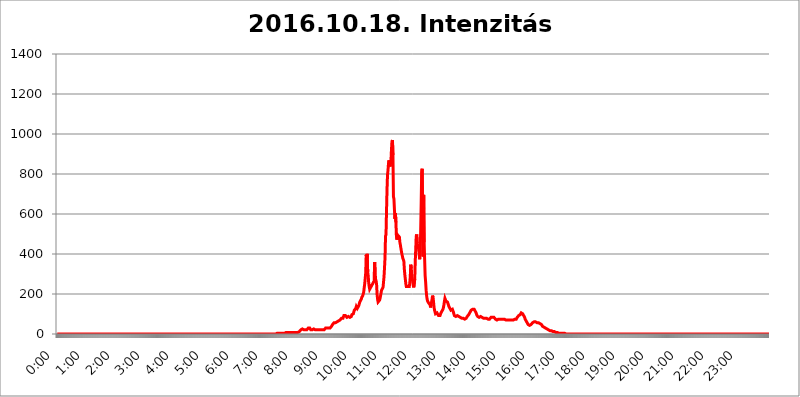
| Category | 2016.10.18. Intenzitás [W/m^2] |
|---|---|
| 0.0 | 0 |
| 0.0006944444444444445 | 0 |
| 0.001388888888888889 | 0 |
| 0.0020833333333333333 | 0 |
| 0.002777777777777778 | 0 |
| 0.003472222222222222 | 0 |
| 0.004166666666666667 | 0 |
| 0.004861111111111111 | 0 |
| 0.005555555555555556 | 0 |
| 0.0062499999999999995 | 0 |
| 0.006944444444444444 | 0 |
| 0.007638888888888889 | 0 |
| 0.008333333333333333 | 0 |
| 0.009027777777777779 | 0 |
| 0.009722222222222222 | 0 |
| 0.010416666666666666 | 0 |
| 0.011111111111111112 | 0 |
| 0.011805555555555555 | 0 |
| 0.012499999999999999 | 0 |
| 0.013194444444444444 | 0 |
| 0.013888888888888888 | 0 |
| 0.014583333333333332 | 0 |
| 0.015277777777777777 | 0 |
| 0.015972222222222224 | 0 |
| 0.016666666666666666 | 0 |
| 0.017361111111111112 | 0 |
| 0.018055555555555557 | 0 |
| 0.01875 | 0 |
| 0.019444444444444445 | 0 |
| 0.02013888888888889 | 0 |
| 0.020833333333333332 | 0 |
| 0.02152777777777778 | 0 |
| 0.022222222222222223 | 0 |
| 0.02291666666666667 | 0 |
| 0.02361111111111111 | 0 |
| 0.024305555555555556 | 0 |
| 0.024999999999999998 | 0 |
| 0.025694444444444447 | 0 |
| 0.02638888888888889 | 0 |
| 0.027083333333333334 | 0 |
| 0.027777777777777776 | 0 |
| 0.02847222222222222 | 0 |
| 0.029166666666666664 | 0 |
| 0.029861111111111113 | 0 |
| 0.030555555555555555 | 0 |
| 0.03125 | 0 |
| 0.03194444444444445 | 0 |
| 0.03263888888888889 | 0 |
| 0.03333333333333333 | 0 |
| 0.034027777777777775 | 0 |
| 0.034722222222222224 | 0 |
| 0.035416666666666666 | 0 |
| 0.036111111111111115 | 0 |
| 0.03680555555555556 | 0 |
| 0.0375 | 0 |
| 0.03819444444444444 | 0 |
| 0.03888888888888889 | 0 |
| 0.03958333333333333 | 0 |
| 0.04027777777777778 | 0 |
| 0.04097222222222222 | 0 |
| 0.041666666666666664 | 0 |
| 0.042361111111111106 | 0 |
| 0.04305555555555556 | 0 |
| 0.043750000000000004 | 0 |
| 0.044444444444444446 | 0 |
| 0.04513888888888889 | 0 |
| 0.04583333333333334 | 0 |
| 0.04652777777777778 | 0 |
| 0.04722222222222222 | 0 |
| 0.04791666666666666 | 0 |
| 0.04861111111111111 | 0 |
| 0.049305555555555554 | 0 |
| 0.049999999999999996 | 0 |
| 0.05069444444444445 | 0 |
| 0.051388888888888894 | 0 |
| 0.052083333333333336 | 0 |
| 0.05277777777777778 | 0 |
| 0.05347222222222222 | 0 |
| 0.05416666666666667 | 0 |
| 0.05486111111111111 | 0 |
| 0.05555555555555555 | 0 |
| 0.05625 | 0 |
| 0.05694444444444444 | 0 |
| 0.057638888888888885 | 0 |
| 0.05833333333333333 | 0 |
| 0.05902777777777778 | 0 |
| 0.059722222222222225 | 0 |
| 0.06041666666666667 | 0 |
| 0.061111111111111116 | 0 |
| 0.06180555555555556 | 0 |
| 0.0625 | 0 |
| 0.06319444444444444 | 0 |
| 0.06388888888888888 | 0 |
| 0.06458333333333334 | 0 |
| 0.06527777777777778 | 0 |
| 0.06597222222222222 | 0 |
| 0.06666666666666667 | 0 |
| 0.06736111111111111 | 0 |
| 0.06805555555555555 | 0 |
| 0.06874999999999999 | 0 |
| 0.06944444444444443 | 0 |
| 0.07013888888888889 | 0 |
| 0.07083333333333333 | 0 |
| 0.07152777777777779 | 0 |
| 0.07222222222222223 | 0 |
| 0.07291666666666667 | 0 |
| 0.07361111111111111 | 0 |
| 0.07430555555555556 | 0 |
| 0.075 | 0 |
| 0.07569444444444444 | 0 |
| 0.0763888888888889 | 0 |
| 0.07708333333333334 | 0 |
| 0.07777777777777778 | 0 |
| 0.07847222222222222 | 0 |
| 0.07916666666666666 | 0 |
| 0.0798611111111111 | 0 |
| 0.08055555555555556 | 0 |
| 0.08125 | 0 |
| 0.08194444444444444 | 0 |
| 0.08263888888888889 | 0 |
| 0.08333333333333333 | 0 |
| 0.08402777777777777 | 0 |
| 0.08472222222222221 | 0 |
| 0.08541666666666665 | 0 |
| 0.08611111111111112 | 0 |
| 0.08680555555555557 | 0 |
| 0.08750000000000001 | 0 |
| 0.08819444444444445 | 0 |
| 0.08888888888888889 | 0 |
| 0.08958333333333333 | 0 |
| 0.09027777777777778 | 0 |
| 0.09097222222222222 | 0 |
| 0.09166666666666667 | 0 |
| 0.09236111111111112 | 0 |
| 0.09305555555555556 | 0 |
| 0.09375 | 0 |
| 0.09444444444444444 | 0 |
| 0.09513888888888888 | 0 |
| 0.09583333333333333 | 0 |
| 0.09652777777777777 | 0 |
| 0.09722222222222222 | 0 |
| 0.09791666666666667 | 0 |
| 0.09861111111111111 | 0 |
| 0.09930555555555555 | 0 |
| 0.09999999999999999 | 0 |
| 0.10069444444444443 | 0 |
| 0.1013888888888889 | 0 |
| 0.10208333333333335 | 0 |
| 0.10277777777777779 | 0 |
| 0.10347222222222223 | 0 |
| 0.10416666666666667 | 0 |
| 0.10486111111111111 | 0 |
| 0.10555555555555556 | 0 |
| 0.10625 | 0 |
| 0.10694444444444444 | 0 |
| 0.1076388888888889 | 0 |
| 0.10833333333333334 | 0 |
| 0.10902777777777778 | 0 |
| 0.10972222222222222 | 0 |
| 0.1111111111111111 | 0 |
| 0.11180555555555556 | 0 |
| 0.11180555555555556 | 0 |
| 0.1125 | 0 |
| 0.11319444444444444 | 0 |
| 0.11388888888888889 | 0 |
| 0.11458333333333333 | 0 |
| 0.11527777777777777 | 0 |
| 0.11597222222222221 | 0 |
| 0.11666666666666665 | 0 |
| 0.1173611111111111 | 0 |
| 0.11805555555555557 | 0 |
| 0.11944444444444445 | 0 |
| 0.12013888888888889 | 0 |
| 0.12083333333333333 | 0 |
| 0.12152777777777778 | 0 |
| 0.12222222222222223 | 0 |
| 0.12291666666666667 | 0 |
| 0.12291666666666667 | 0 |
| 0.12361111111111112 | 0 |
| 0.12430555555555556 | 0 |
| 0.125 | 0 |
| 0.12569444444444444 | 0 |
| 0.12638888888888888 | 0 |
| 0.12708333333333333 | 0 |
| 0.16875 | 0 |
| 0.12847222222222224 | 0 |
| 0.12916666666666668 | 0 |
| 0.12986111111111112 | 0 |
| 0.13055555555555556 | 0 |
| 0.13125 | 0 |
| 0.13194444444444445 | 0 |
| 0.1326388888888889 | 0 |
| 0.13333333333333333 | 0 |
| 0.13402777777777777 | 0 |
| 0.13402777777777777 | 0 |
| 0.13472222222222222 | 0 |
| 0.13541666666666666 | 0 |
| 0.1361111111111111 | 0 |
| 0.13749999999999998 | 0 |
| 0.13819444444444443 | 0 |
| 0.1388888888888889 | 0 |
| 0.13958333333333334 | 0 |
| 0.14027777777777778 | 0 |
| 0.14097222222222222 | 0 |
| 0.14166666666666666 | 0 |
| 0.1423611111111111 | 0 |
| 0.14305555555555557 | 0 |
| 0.14375000000000002 | 0 |
| 0.14444444444444446 | 0 |
| 0.1451388888888889 | 0 |
| 0.1451388888888889 | 0 |
| 0.14652777777777778 | 0 |
| 0.14722222222222223 | 0 |
| 0.14791666666666667 | 0 |
| 0.1486111111111111 | 0 |
| 0.14930555555555555 | 0 |
| 0.15 | 0 |
| 0.15069444444444444 | 0 |
| 0.15138888888888888 | 0 |
| 0.15208333333333332 | 0 |
| 0.15277777777777776 | 0 |
| 0.15347222222222223 | 0 |
| 0.15416666666666667 | 0 |
| 0.15486111111111112 | 0 |
| 0.15555555555555556 | 0 |
| 0.15625 | 0 |
| 0.15694444444444444 | 0 |
| 0.15763888888888888 | 0 |
| 0.15833333333333333 | 0 |
| 0.15902777777777777 | 0 |
| 0.15972222222222224 | 0 |
| 0.16041666666666668 | 0 |
| 0.16111111111111112 | 0 |
| 0.16180555555555556 | 0 |
| 0.1625 | 0 |
| 0.16319444444444445 | 0 |
| 0.1638888888888889 | 0 |
| 0.16458333333333333 | 0 |
| 0.16527777777777777 | 0 |
| 0.16597222222222222 | 0 |
| 0.16666666666666666 | 0 |
| 0.1673611111111111 | 0 |
| 0.16805555555555554 | 0 |
| 0.16874999999999998 | 0 |
| 0.16944444444444443 | 0 |
| 0.17013888888888887 | 0 |
| 0.1708333333333333 | 0 |
| 0.17152777777777775 | 0 |
| 0.17222222222222225 | 0 |
| 0.1729166666666667 | 0 |
| 0.17361111111111113 | 0 |
| 0.17430555555555557 | 0 |
| 0.17500000000000002 | 0 |
| 0.17569444444444446 | 0 |
| 0.1763888888888889 | 0 |
| 0.17708333333333334 | 0 |
| 0.17777777777777778 | 0 |
| 0.17847222222222223 | 0 |
| 0.17916666666666667 | 0 |
| 0.1798611111111111 | 0 |
| 0.18055555555555555 | 0 |
| 0.18125 | 0 |
| 0.18194444444444444 | 0 |
| 0.1826388888888889 | 0 |
| 0.18333333333333335 | 0 |
| 0.1840277777777778 | 0 |
| 0.18472222222222223 | 0 |
| 0.18541666666666667 | 0 |
| 0.18611111111111112 | 0 |
| 0.18680555555555556 | 0 |
| 0.1875 | 0 |
| 0.18819444444444444 | 0 |
| 0.18888888888888888 | 0 |
| 0.18958333333333333 | 0 |
| 0.19027777777777777 | 0 |
| 0.1909722222222222 | 0 |
| 0.19166666666666665 | 0 |
| 0.19236111111111112 | 0 |
| 0.19305555555555554 | 0 |
| 0.19375 | 0 |
| 0.19444444444444445 | 0 |
| 0.1951388888888889 | 0 |
| 0.19583333333333333 | 0 |
| 0.19652777777777777 | 0 |
| 0.19722222222222222 | 0 |
| 0.19791666666666666 | 0 |
| 0.1986111111111111 | 0 |
| 0.19930555555555554 | 0 |
| 0.19999999999999998 | 0 |
| 0.20069444444444443 | 0 |
| 0.20138888888888887 | 0 |
| 0.2020833333333333 | 0 |
| 0.2027777777777778 | 0 |
| 0.2034722222222222 | 0 |
| 0.2041666666666667 | 0 |
| 0.20486111111111113 | 0 |
| 0.20555555555555557 | 0 |
| 0.20625000000000002 | 0 |
| 0.20694444444444446 | 0 |
| 0.2076388888888889 | 0 |
| 0.20833333333333334 | 0 |
| 0.20902777777777778 | 0 |
| 0.20972222222222223 | 0 |
| 0.21041666666666667 | 0 |
| 0.2111111111111111 | 0 |
| 0.21180555555555555 | 0 |
| 0.2125 | 0 |
| 0.21319444444444444 | 0 |
| 0.2138888888888889 | 0 |
| 0.21458333333333335 | 0 |
| 0.2152777777777778 | 0 |
| 0.21597222222222223 | 0 |
| 0.21666666666666667 | 0 |
| 0.21736111111111112 | 0 |
| 0.21805555555555556 | 0 |
| 0.21875 | 0 |
| 0.21944444444444444 | 0 |
| 0.22013888888888888 | 0 |
| 0.22083333333333333 | 0 |
| 0.22152777777777777 | 0 |
| 0.2222222222222222 | 0 |
| 0.22291666666666665 | 0 |
| 0.2236111111111111 | 0 |
| 0.22430555555555556 | 0 |
| 0.225 | 0 |
| 0.22569444444444445 | 0 |
| 0.2263888888888889 | 0 |
| 0.22708333333333333 | 0 |
| 0.22777777777777777 | 0 |
| 0.22847222222222222 | 0 |
| 0.22916666666666666 | 0 |
| 0.2298611111111111 | 0 |
| 0.23055555555555554 | 0 |
| 0.23124999999999998 | 0 |
| 0.23194444444444443 | 0 |
| 0.23263888888888887 | 0 |
| 0.2333333333333333 | 0 |
| 0.2340277777777778 | 0 |
| 0.2347222222222222 | 0 |
| 0.2354166666666667 | 0 |
| 0.23611111111111113 | 0 |
| 0.23680555555555557 | 0 |
| 0.23750000000000002 | 0 |
| 0.23819444444444446 | 0 |
| 0.2388888888888889 | 0 |
| 0.23958333333333334 | 0 |
| 0.24027777777777778 | 0 |
| 0.24097222222222223 | 0 |
| 0.24166666666666667 | 0 |
| 0.2423611111111111 | 0 |
| 0.24305555555555555 | 0 |
| 0.24375 | 0 |
| 0.24444444444444446 | 0 |
| 0.24513888888888888 | 0 |
| 0.24583333333333335 | 0 |
| 0.2465277777777778 | 0 |
| 0.24722222222222223 | 0 |
| 0.24791666666666667 | 0 |
| 0.24861111111111112 | 0 |
| 0.24930555555555556 | 0 |
| 0.25 | 0 |
| 0.25069444444444444 | 0 |
| 0.2513888888888889 | 0 |
| 0.2520833333333333 | 0 |
| 0.25277777777777777 | 0 |
| 0.2534722222222222 | 0 |
| 0.25416666666666665 | 0 |
| 0.2548611111111111 | 0 |
| 0.2555555555555556 | 0 |
| 0.25625000000000003 | 0 |
| 0.2569444444444445 | 0 |
| 0.2576388888888889 | 0 |
| 0.25833333333333336 | 0 |
| 0.2590277777777778 | 0 |
| 0.25972222222222224 | 0 |
| 0.2604166666666667 | 0 |
| 0.2611111111111111 | 0 |
| 0.26180555555555557 | 0 |
| 0.2625 | 0 |
| 0.26319444444444445 | 0 |
| 0.2638888888888889 | 0 |
| 0.26458333333333334 | 0 |
| 0.2652777777777778 | 0 |
| 0.2659722222222222 | 0 |
| 0.26666666666666666 | 0 |
| 0.2673611111111111 | 0 |
| 0.26805555555555555 | 0 |
| 0.26875 | 0 |
| 0.26944444444444443 | 0 |
| 0.2701388888888889 | 0 |
| 0.2708333333333333 | 0 |
| 0.27152777777777776 | 0 |
| 0.2722222222222222 | 0 |
| 0.27291666666666664 | 0 |
| 0.2736111111111111 | 0 |
| 0.2743055555555555 | 0 |
| 0.27499999999999997 | 0 |
| 0.27569444444444446 | 0 |
| 0.27638888888888885 | 0 |
| 0.27708333333333335 | 0 |
| 0.2777777777777778 | 0 |
| 0.27847222222222223 | 0 |
| 0.2791666666666667 | 0 |
| 0.2798611111111111 | 0 |
| 0.28055555555555556 | 0 |
| 0.28125 | 0 |
| 0.28194444444444444 | 0 |
| 0.2826388888888889 | 0 |
| 0.2833333333333333 | 0 |
| 0.28402777777777777 | 0 |
| 0.2847222222222222 | 0 |
| 0.28541666666666665 | 0 |
| 0.28611111111111115 | 0 |
| 0.28680555555555554 | 0 |
| 0.28750000000000003 | 0 |
| 0.2881944444444445 | 0 |
| 0.2888888888888889 | 0 |
| 0.28958333333333336 | 0 |
| 0.2902777777777778 | 0 |
| 0.29097222222222224 | 0 |
| 0.2916666666666667 | 0 |
| 0.2923611111111111 | 0 |
| 0.29305555555555557 | 0 |
| 0.29375 | 0 |
| 0.29444444444444445 | 0 |
| 0.2951388888888889 | 0 |
| 0.29583333333333334 | 0 |
| 0.2965277777777778 | 0 |
| 0.2972222222222222 | 0 |
| 0.29791666666666666 | 0 |
| 0.2986111111111111 | 0 |
| 0.29930555555555555 | 0 |
| 0.3 | 0 |
| 0.30069444444444443 | 0 |
| 0.3013888888888889 | 0 |
| 0.3020833333333333 | 0 |
| 0.30277777777777776 | 0 |
| 0.3034722222222222 | 0 |
| 0.30416666666666664 | 0 |
| 0.3048611111111111 | 0 |
| 0.3055555555555555 | 0 |
| 0.30624999999999997 | 0 |
| 0.3069444444444444 | 0 |
| 0.3076388888888889 | 0 |
| 0.30833333333333335 | 3.525 |
| 0.3090277777777778 | 3.525 |
| 0.30972222222222223 | 3.525 |
| 0.3104166666666667 | 3.525 |
| 0.3111111111111111 | 3.525 |
| 0.31180555555555556 | 3.525 |
| 0.3125 | 3.525 |
| 0.31319444444444444 | 3.525 |
| 0.3138888888888889 | 3.525 |
| 0.3145833333333333 | 3.525 |
| 0.31527777777777777 | 3.525 |
| 0.3159722222222222 | 3.525 |
| 0.31666666666666665 | 3.525 |
| 0.31736111111111115 | 3.525 |
| 0.31805555555555554 | 3.525 |
| 0.31875000000000003 | 3.525 |
| 0.3194444444444445 | 3.525 |
| 0.3201388888888889 | 3.525 |
| 0.32083333333333336 | 7.887 |
| 0.3215277777777778 | 7.887 |
| 0.32222222222222224 | 7.887 |
| 0.3229166666666667 | 7.887 |
| 0.3236111111111111 | 7.887 |
| 0.32430555555555557 | 7.887 |
| 0.325 | 7.887 |
| 0.32569444444444445 | 7.887 |
| 0.3263888888888889 | 7.887 |
| 0.32708333333333334 | 7.887 |
| 0.3277777777777778 | 7.887 |
| 0.3284722222222222 | 7.887 |
| 0.32916666666666666 | 7.887 |
| 0.3298611111111111 | 7.887 |
| 0.33055555555555555 | 7.887 |
| 0.33125 | 7.887 |
| 0.33194444444444443 | 7.887 |
| 0.3326388888888889 | 7.887 |
| 0.3333333333333333 | 7.887 |
| 0.3340277777777778 | 7.887 |
| 0.3347222222222222 | 7.887 |
| 0.3354166666666667 | 7.887 |
| 0.3361111111111111 | 7.887 |
| 0.3368055555555556 | 7.887 |
| 0.33749999999999997 | 7.887 |
| 0.33819444444444446 | 7.887 |
| 0.33888888888888885 | 12.257 |
| 0.33958333333333335 | 12.257 |
| 0.34027777777777773 | 12.257 |
| 0.34097222222222223 | 16.636 |
| 0.3416666666666666 | 21.024 |
| 0.3423611111111111 | 21.024 |
| 0.3430555555555555 | 21.024 |
| 0.34375 | 25.419 |
| 0.3444444444444445 | 25.419 |
| 0.3451388888888889 | 25.419 |
| 0.3458333333333334 | 21.024 |
| 0.34652777777777777 | 21.024 |
| 0.34722222222222227 | 21.024 |
| 0.34791666666666665 | 21.024 |
| 0.34861111111111115 | 21.024 |
| 0.34930555555555554 | 21.024 |
| 0.35000000000000003 | 21.024 |
| 0.3506944444444444 | 25.419 |
| 0.3513888888888889 | 25.419 |
| 0.3520833333333333 | 29.823 |
| 0.3527777777777778 | 29.823 |
| 0.3534722222222222 | 29.823 |
| 0.3541666666666667 | 29.823 |
| 0.3548611111111111 | 25.419 |
| 0.35555555555555557 | 21.024 |
| 0.35625 | 21.024 |
| 0.35694444444444445 | 21.024 |
| 0.3576388888888889 | 21.024 |
| 0.35833333333333334 | 21.024 |
| 0.3590277777777778 | 21.024 |
| 0.3597222222222222 | 25.419 |
| 0.36041666666666666 | 21.024 |
| 0.3611111111111111 | 21.024 |
| 0.36180555555555555 | 21.024 |
| 0.3625 | 21.024 |
| 0.36319444444444443 | 21.024 |
| 0.3638888888888889 | 21.024 |
| 0.3645833333333333 | 21.024 |
| 0.3652777777777778 | 21.024 |
| 0.3659722222222222 | 21.024 |
| 0.3666666666666667 | 21.024 |
| 0.3673611111111111 | 21.024 |
| 0.3680555555555556 | 21.024 |
| 0.36874999999999997 | 21.024 |
| 0.36944444444444446 | 21.024 |
| 0.37013888888888885 | 21.024 |
| 0.37083333333333335 | 21.024 |
| 0.37152777777777773 | 21.024 |
| 0.37222222222222223 | 21.024 |
| 0.3729166666666666 | 21.024 |
| 0.3736111111111111 | 21.024 |
| 0.3743055555555555 | 21.024 |
| 0.375 | 25.419 |
| 0.3756944444444445 | 25.419 |
| 0.3763888888888889 | 29.823 |
| 0.3770833333333334 | 29.823 |
| 0.37777777777777777 | 29.823 |
| 0.37847222222222227 | 29.823 |
| 0.37916666666666665 | 34.234 |
| 0.37986111111111115 | 34.234 |
| 0.38055555555555554 | 29.823 |
| 0.38125000000000003 | 29.823 |
| 0.3819444444444444 | 29.823 |
| 0.3826388888888889 | 29.823 |
| 0.3833333333333333 | 34.234 |
| 0.3840277777777778 | 34.234 |
| 0.3847222222222222 | 38.653 |
| 0.3854166666666667 | 43.079 |
| 0.3861111111111111 | 47.511 |
| 0.38680555555555557 | 51.951 |
| 0.3875 | 51.951 |
| 0.38819444444444445 | 56.398 |
| 0.3888888888888889 | 56.398 |
| 0.38958333333333334 | 56.398 |
| 0.3902777777777778 | 56.398 |
| 0.3909722222222222 | 56.398 |
| 0.39166666666666666 | 56.398 |
| 0.3923611111111111 | 60.85 |
| 0.39305555555555555 | 60.85 |
| 0.39375 | 65.31 |
| 0.39444444444444443 | 65.31 |
| 0.3951388888888889 | 65.31 |
| 0.3958333333333333 | 69.775 |
| 0.3965277777777778 | 69.775 |
| 0.3972222222222222 | 69.775 |
| 0.3979166666666667 | 74.246 |
| 0.3986111111111111 | 78.722 |
| 0.3993055555555556 | 78.722 |
| 0.39999999999999997 | 78.722 |
| 0.40069444444444446 | 78.722 |
| 0.40138888888888885 | 83.205 |
| 0.40208333333333335 | 92.184 |
| 0.40277777777777773 | 96.682 |
| 0.40347222222222223 | 96.682 |
| 0.4041666666666666 | 92.184 |
| 0.4048611111111111 | 92.184 |
| 0.4055555555555555 | 87.692 |
| 0.40625 | 83.205 |
| 0.4069444444444445 | 83.205 |
| 0.4076388888888889 | 83.205 |
| 0.4083333333333334 | 87.692 |
| 0.40902777777777777 | 87.692 |
| 0.40972222222222227 | 87.692 |
| 0.41041666666666665 | 83.205 |
| 0.41111111111111115 | 83.205 |
| 0.41180555555555554 | 83.205 |
| 0.41250000000000003 | 87.692 |
| 0.4131944444444444 | 96.682 |
| 0.4138888888888889 | 101.184 |
| 0.4145833333333333 | 96.682 |
| 0.4152777777777778 | 101.184 |
| 0.4159722222222222 | 110.201 |
| 0.4166666666666667 | 119.235 |
| 0.4173611111111111 | 123.758 |
| 0.41805555555555557 | 123.758 |
| 0.41875 | 128.284 |
| 0.41944444444444445 | 137.347 |
| 0.4201388888888889 | 132.814 |
| 0.42083333333333334 | 128.284 |
| 0.4215277777777778 | 128.284 |
| 0.4222222222222222 | 132.814 |
| 0.42291666666666666 | 141.884 |
| 0.4236111111111111 | 150.964 |
| 0.42430555555555555 | 160.056 |
| 0.425 | 160.056 |
| 0.42569444444444443 | 164.605 |
| 0.4263888888888889 | 173.709 |
| 0.4270833333333333 | 182.82 |
| 0.4277777777777778 | 187.378 |
| 0.4284722222222222 | 191.937 |
| 0.4291666666666667 | 201.058 |
| 0.4298611111111111 | 210.182 |
| 0.4305555555555556 | 233 |
| 0.43124999999999997 | 251.251 |
| 0.43194444444444446 | 278.603 |
| 0.43263888888888885 | 305.898 |
| 0.43333333333333335 | 396.164 |
| 0.43402777777777773 | 378.224 |
| 0.43472222222222223 | 400.638 |
| 0.4354166666666666 | 310.44 |
| 0.4361111111111111 | 292.259 |
| 0.4368055555555555 | 255.813 |
| 0.4375 | 237.564 |
| 0.4381944444444445 | 223.873 |
| 0.4388888888888889 | 223.873 |
| 0.4395833333333334 | 228.436 |
| 0.44027777777777777 | 237.564 |
| 0.44097222222222227 | 237.564 |
| 0.44166666666666665 | 246.689 |
| 0.44236111111111115 | 251.251 |
| 0.44305555555555554 | 255.813 |
| 0.44375000000000003 | 255.813 |
| 0.4444444444444444 | 264.932 |
| 0.4451388888888889 | 360.221 |
| 0.4458333333333333 | 305.898 |
| 0.4465277777777778 | 274.047 |
| 0.4472222222222222 | 264.932 |
| 0.4479166666666667 | 246.689 |
| 0.4486111111111111 | 196.497 |
| 0.44930555555555557 | 173.709 |
| 0.45 | 160.056 |
| 0.45069444444444445 | 155.509 |
| 0.4513888888888889 | 160.056 |
| 0.45208333333333334 | 169.156 |
| 0.4527777777777778 | 178.264 |
| 0.4534722222222222 | 191.937 |
| 0.45416666666666666 | 196.497 |
| 0.4548611111111111 | 219.309 |
| 0.45555555555555555 | 214.746 |
| 0.45625 | 223.873 |
| 0.45694444444444443 | 233 |
| 0.4576388888888889 | 260.373 |
| 0.4583333333333333 | 287.709 |
| 0.4590277777777778 | 333.113 |
| 0.4597222222222222 | 382.715 |
| 0.4604166666666667 | 489.108 |
| 0.4611111111111111 | 497.836 |
| 0.4618055555555556 | 613.252 |
| 0.46249999999999997 | 719.877 |
| 0.46319444444444446 | 795.074 |
| 0.46388888888888885 | 818.392 |
| 0.46458333333333335 | 853.029 |
| 0.46527777777777773 | 868.305 |
| 0.46597222222222223 | 872.114 |
| 0.4666666666666666 | 837.682 |
| 0.4673611111111111 | 853.029 |
| 0.4680555555555555 | 868.305 |
| 0.46875 | 921.298 |
| 0.4694444444444445 | 962.555 |
| 0.4701388888888889 | 970.034 |
| 0.4708333333333334 | 894.885 |
| 0.47152777777777777 | 687.544 |
| 0.47222222222222227 | 675.311 |
| 0.47291666666666665 | 621.613 |
| 0.47361111111111115 | 575.299 |
| 0.47430555555555554 | 604.864 |
| 0.47500000000000003 | 558.261 |
| 0.4756944444444444 | 489.108 |
| 0.4763888888888889 | 471.582 |
| 0.4770833333333333 | 467.187 |
| 0.4777777777777778 | 493.475 |
| 0.4784722222222222 | 489.108 |
| 0.4791666666666667 | 493.475 |
| 0.4798611111111111 | 484.735 |
| 0.48055555555555557 | 458.38 |
| 0.48125 | 445.129 |
| 0.48194444444444445 | 440.702 |
| 0.4826388888888889 | 414.035 |
| 0.48333333333333334 | 400.638 |
| 0.4840277777777778 | 400.638 |
| 0.4847222222222222 | 378.224 |
| 0.48541666666666666 | 378.224 |
| 0.4861111111111111 | 364.728 |
| 0.48680555555555555 | 324.052 |
| 0.4875 | 296.808 |
| 0.48819444444444443 | 274.047 |
| 0.4888888888888889 | 251.251 |
| 0.4895833333333333 | 237.564 |
| 0.4902777777777778 | 237.564 |
| 0.4909722222222222 | 242.127 |
| 0.4916666666666667 | 237.564 |
| 0.4923611111111111 | 237.564 |
| 0.4930555555555556 | 233 |
| 0.49374999999999997 | 237.564 |
| 0.49444444444444446 | 255.813 |
| 0.49513888888888885 | 287.709 |
| 0.49583333333333335 | 346.682 |
| 0.49652777777777773 | 328.584 |
| 0.49722222222222223 | 287.709 |
| 0.4979166666666666 | 283.156 |
| 0.4986111111111111 | 260.373 |
| 0.4993055555555555 | 242.127 |
| 0.5 | 233 |
| 0.5006944444444444 | 233 |
| 0.5013888888888889 | 274.047 |
| 0.5020833333333333 | 360.221 |
| 0.5027777777777778 | 422.943 |
| 0.5034722222222222 | 489.108 |
| 0.5041666666666667 | 497.836 |
| 0.5048611111111111 | 453.968 |
| 0.5055555555555555 | 436.27 |
| 0.50625 | 449.551 |
| 0.5069444444444444 | 422.943 |
| 0.5076388888888889 | 418.492 |
| 0.5083333333333333 | 373.729 |
| 0.5090277777777777 | 418.492 |
| 0.5097222222222222 | 515.223 |
| 0.5104166666666666 | 650.667 |
| 0.5111111111111112 | 806.757 |
| 0.5118055555555555 | 826.123 |
| 0.5125000000000001 | 588.009 |
| 0.5131944444444444 | 387.202 |
| 0.513888888888889 | 695.666 |
| 0.5145833333333333 | 458.38 |
| 0.5152777777777778 | 373.729 |
| 0.5159722222222222 | 292.259 |
| 0.5166666666666667 | 260.373 |
| 0.517361111111111 | 219.309 |
| 0.5180555555555556 | 191.937 |
| 0.5187499999999999 | 173.709 |
| 0.5194444444444445 | 164.605 |
| 0.5201388888888888 | 160.056 |
| 0.5208333333333334 | 155.509 |
| 0.5215277777777778 | 150.964 |
| 0.5222222222222223 | 155.509 |
| 0.5229166666666667 | 146.423 |
| 0.5236111111111111 | 132.814 |
| 0.5243055555555556 | 146.423 |
| 0.525 | 160.056 |
| 0.5256944444444445 | 173.709 |
| 0.5263888888888889 | 191.937 |
| 0.5270833333333333 | 182.82 |
| 0.5277777777777778 | 160.056 |
| 0.5284722222222222 | 132.814 |
| 0.5291666666666667 | 119.235 |
| 0.5298611111111111 | 110.201 |
| 0.5305555555555556 | 101.184 |
| 0.53125 | 101.184 |
| 0.5319444444444444 | 101.184 |
| 0.5326388888888889 | 105.69 |
| 0.5333333333333333 | 110.201 |
| 0.5340277777777778 | 101.184 |
| 0.5347222222222222 | 92.184 |
| 0.5354166666666667 | 92.184 |
| 0.5361111111111111 | 92.184 |
| 0.5368055555555555 | 92.184 |
| 0.5375 | 96.682 |
| 0.5381944444444444 | 105.69 |
| 0.5388888888888889 | 110.201 |
| 0.5395833333333333 | 114.716 |
| 0.5402777777777777 | 119.235 |
| 0.5409722222222222 | 123.758 |
| 0.5416666666666666 | 132.814 |
| 0.5423611111111112 | 146.423 |
| 0.5430555555555555 | 164.605 |
| 0.5437500000000001 | 178.264 |
| 0.5444444444444444 | 173.709 |
| 0.545138888888889 | 164.605 |
| 0.5458333333333333 | 160.056 |
| 0.5465277777777778 | 160.056 |
| 0.5472222222222222 | 160.056 |
| 0.5479166666666667 | 155.509 |
| 0.548611111111111 | 146.423 |
| 0.5493055555555556 | 137.347 |
| 0.5499999999999999 | 132.814 |
| 0.5506944444444445 | 128.284 |
| 0.5513888888888888 | 123.758 |
| 0.5520833333333334 | 119.235 |
| 0.5527777777777778 | 123.758 |
| 0.5534722222222223 | 123.758 |
| 0.5541666666666667 | 123.758 |
| 0.5548611111111111 | 119.235 |
| 0.5555555555555556 | 110.201 |
| 0.55625 | 101.184 |
| 0.5569444444444445 | 92.184 |
| 0.5576388888888889 | 92.184 |
| 0.5583333333333333 | 87.692 |
| 0.5590277777777778 | 87.692 |
| 0.5597222222222222 | 92.184 |
| 0.5604166666666667 | 92.184 |
| 0.5611111111111111 | 92.184 |
| 0.5618055555555556 | 92.184 |
| 0.5625 | 87.692 |
| 0.5631944444444444 | 87.692 |
| 0.5638888888888889 | 87.692 |
| 0.5645833333333333 | 83.205 |
| 0.5652777777777778 | 83.205 |
| 0.5659722222222222 | 83.205 |
| 0.5666666666666667 | 78.722 |
| 0.5673611111111111 | 78.722 |
| 0.5680555555555555 | 78.722 |
| 0.56875 | 78.722 |
| 0.5694444444444444 | 78.722 |
| 0.5701388888888889 | 74.246 |
| 0.5708333333333333 | 74.246 |
| 0.5715277777777777 | 74.246 |
| 0.5722222222222222 | 74.246 |
| 0.5729166666666666 | 78.722 |
| 0.5736111111111112 | 78.722 |
| 0.5743055555555555 | 83.205 |
| 0.5750000000000001 | 87.692 |
| 0.5756944444444444 | 92.184 |
| 0.576388888888889 | 92.184 |
| 0.5770833333333333 | 96.682 |
| 0.5777777777777778 | 101.184 |
| 0.5784722222222222 | 101.184 |
| 0.5791666666666667 | 110.201 |
| 0.579861111111111 | 110.201 |
| 0.5805555555555556 | 119.235 |
| 0.5812499999999999 | 123.758 |
| 0.5819444444444445 | 123.758 |
| 0.5826388888888888 | 123.758 |
| 0.5833333333333334 | 123.758 |
| 0.5840277777777778 | 123.758 |
| 0.5847222222222223 | 123.758 |
| 0.5854166666666667 | 119.235 |
| 0.5861111111111111 | 114.716 |
| 0.5868055555555556 | 110.201 |
| 0.5875 | 105.69 |
| 0.5881944444444445 | 96.682 |
| 0.5888888888888889 | 92.184 |
| 0.5895833333333333 | 87.692 |
| 0.5902777777777778 | 83.205 |
| 0.5909722222222222 | 83.205 |
| 0.5916666666666667 | 83.205 |
| 0.5923611111111111 | 83.205 |
| 0.5930555555555556 | 83.205 |
| 0.59375 | 87.692 |
| 0.5944444444444444 | 83.205 |
| 0.5951388888888889 | 83.205 |
| 0.5958333333333333 | 83.205 |
| 0.5965277777777778 | 83.205 |
| 0.5972222222222222 | 83.205 |
| 0.5979166666666667 | 78.722 |
| 0.5986111111111111 | 78.722 |
| 0.5993055555555555 | 78.722 |
| 0.6 | 78.722 |
| 0.6006944444444444 | 78.722 |
| 0.6013888888888889 | 78.722 |
| 0.6020833333333333 | 78.722 |
| 0.6027777777777777 | 78.722 |
| 0.6034722222222222 | 78.722 |
| 0.6041666666666666 | 74.246 |
| 0.6048611111111112 | 74.246 |
| 0.6055555555555555 | 74.246 |
| 0.6062500000000001 | 74.246 |
| 0.6069444444444444 | 74.246 |
| 0.607638888888889 | 78.722 |
| 0.6083333333333333 | 83.205 |
| 0.6090277777777778 | 83.205 |
| 0.6097222222222222 | 83.205 |
| 0.6104166666666667 | 83.205 |
| 0.611111111111111 | 83.205 |
| 0.6118055555555556 | 83.205 |
| 0.6124999999999999 | 83.205 |
| 0.6131944444444445 | 83.205 |
| 0.6138888888888888 | 78.722 |
| 0.6145833333333334 | 74.246 |
| 0.6152777777777778 | 74.246 |
| 0.6159722222222223 | 69.775 |
| 0.6166666666666667 | 69.775 |
| 0.6173611111111111 | 74.246 |
| 0.6180555555555556 | 74.246 |
| 0.61875 | 74.246 |
| 0.6194444444444445 | 74.246 |
| 0.6201388888888889 | 74.246 |
| 0.6208333333333333 | 74.246 |
| 0.6215277777777778 | 74.246 |
| 0.6222222222222222 | 74.246 |
| 0.6229166666666667 | 74.246 |
| 0.6236111111111111 | 74.246 |
| 0.6243055555555556 | 74.246 |
| 0.625 | 74.246 |
| 0.6256944444444444 | 74.246 |
| 0.6263888888888889 | 74.246 |
| 0.6270833333333333 | 74.246 |
| 0.6277777777777778 | 69.775 |
| 0.6284722222222222 | 69.775 |
| 0.6291666666666667 | 69.775 |
| 0.6298611111111111 | 69.775 |
| 0.6305555555555555 | 69.775 |
| 0.63125 | 69.775 |
| 0.6319444444444444 | 69.775 |
| 0.6326388888888889 | 69.775 |
| 0.6333333333333333 | 69.775 |
| 0.6340277777777777 | 69.775 |
| 0.6347222222222222 | 74.246 |
| 0.6354166666666666 | 69.775 |
| 0.6361111111111112 | 69.775 |
| 0.6368055555555555 | 69.775 |
| 0.6375000000000001 | 69.775 |
| 0.6381944444444444 | 69.775 |
| 0.638888888888889 | 69.775 |
| 0.6395833333333333 | 69.775 |
| 0.6402777777777778 | 69.775 |
| 0.6409722222222222 | 69.775 |
| 0.6416666666666667 | 74.246 |
| 0.642361111111111 | 74.246 |
| 0.6430555555555556 | 74.246 |
| 0.6437499999999999 | 74.246 |
| 0.6444444444444445 | 78.722 |
| 0.6451388888888888 | 83.205 |
| 0.6458333333333334 | 87.692 |
| 0.6465277777777778 | 87.692 |
| 0.6472222222222223 | 92.184 |
| 0.6479166666666667 | 92.184 |
| 0.6486111111111111 | 92.184 |
| 0.6493055555555556 | 96.682 |
| 0.65 | 101.184 |
| 0.6506944444444445 | 105.69 |
| 0.6513888888888889 | 105.69 |
| 0.6520833333333333 | 105.69 |
| 0.6527777777777778 | 101.184 |
| 0.6534722222222222 | 96.682 |
| 0.6541666666666667 | 92.184 |
| 0.6548611111111111 | 87.692 |
| 0.6555555555555556 | 83.205 |
| 0.65625 | 74.246 |
| 0.6569444444444444 | 69.775 |
| 0.6576388888888889 | 65.31 |
| 0.6583333333333333 | 60.85 |
| 0.6590277777777778 | 56.398 |
| 0.6597222222222222 | 56.398 |
| 0.6604166666666667 | 47.511 |
| 0.6611111111111111 | 47.511 |
| 0.6618055555555555 | 43.079 |
| 0.6625 | 43.079 |
| 0.6631944444444444 | 43.079 |
| 0.6638888888888889 | 43.079 |
| 0.6645833333333333 | 47.511 |
| 0.6652777777777777 | 47.511 |
| 0.6659722222222222 | 51.951 |
| 0.6666666666666666 | 56.398 |
| 0.6673611111111111 | 60.85 |
| 0.6680555555555556 | 60.85 |
| 0.6687500000000001 | 60.85 |
| 0.6694444444444444 | 60.85 |
| 0.6701388888888888 | 60.85 |
| 0.6708333333333334 | 60.85 |
| 0.6715277777777778 | 56.398 |
| 0.6722222222222222 | 56.398 |
| 0.6729166666666666 | 56.398 |
| 0.6736111111111112 | 56.398 |
| 0.6743055555555556 | 56.398 |
| 0.6749999999999999 | 56.398 |
| 0.6756944444444444 | 56.398 |
| 0.6763888888888889 | 56.398 |
| 0.6770833333333334 | 51.951 |
| 0.6777777777777777 | 51.951 |
| 0.6784722222222223 | 47.511 |
| 0.6791666666666667 | 47.511 |
| 0.6798611111111111 | 43.079 |
| 0.6805555555555555 | 38.653 |
| 0.68125 | 38.653 |
| 0.6819444444444445 | 34.234 |
| 0.6826388888888889 | 34.234 |
| 0.6833333333333332 | 29.823 |
| 0.6840277777777778 | 29.823 |
| 0.6847222222222222 | 29.823 |
| 0.6854166666666667 | 25.419 |
| 0.686111111111111 | 25.419 |
| 0.6868055555555556 | 25.419 |
| 0.6875 | 21.024 |
| 0.6881944444444444 | 21.024 |
| 0.688888888888889 | 21.024 |
| 0.6895833333333333 | 21.024 |
| 0.6902777777777778 | 16.636 |
| 0.6909722222222222 | 16.636 |
| 0.6916666666666668 | 16.636 |
| 0.6923611111111111 | 16.636 |
| 0.6930555555555555 | 16.636 |
| 0.69375 | 12.257 |
| 0.6944444444444445 | 12.257 |
| 0.6951388888888889 | 12.257 |
| 0.6958333333333333 | 12.257 |
| 0.6965277777777777 | 12.257 |
| 0.6972222222222223 | 12.257 |
| 0.6979166666666666 | 12.257 |
| 0.6986111111111111 | 7.887 |
| 0.6993055555555556 | 7.887 |
| 0.7000000000000001 | 7.887 |
| 0.7006944444444444 | 7.887 |
| 0.7013888888888888 | 7.887 |
| 0.7020833333333334 | 3.525 |
| 0.7027777777777778 | 3.525 |
| 0.7034722222222222 | 3.525 |
| 0.7041666666666666 | 3.525 |
| 0.7048611111111112 | 3.525 |
| 0.7055555555555556 | 3.525 |
| 0.7062499999999999 | 3.525 |
| 0.7069444444444444 | 3.525 |
| 0.7076388888888889 | 3.525 |
| 0.7083333333333334 | 3.525 |
| 0.7090277777777777 | 3.525 |
| 0.7097222222222223 | 3.525 |
| 0.7104166666666667 | 3.525 |
| 0.7111111111111111 | 3.525 |
| 0.7118055555555555 | 3.525 |
| 0.7125 | 3.525 |
| 0.7131944444444445 | 3.525 |
| 0.7138888888888889 | 0 |
| 0.7145833333333332 | 0 |
| 0.7152777777777778 | 0 |
| 0.7159722222222222 | 0 |
| 0.7166666666666667 | 0 |
| 0.717361111111111 | 0 |
| 0.7180555555555556 | 0 |
| 0.71875 | 0 |
| 0.7194444444444444 | 0 |
| 0.720138888888889 | 0 |
| 0.7208333333333333 | 0 |
| 0.7215277777777778 | 0 |
| 0.7222222222222222 | 0 |
| 0.7229166666666668 | 0 |
| 0.7236111111111111 | 0 |
| 0.7243055555555555 | 0 |
| 0.725 | 0 |
| 0.7256944444444445 | 0 |
| 0.7263888888888889 | 0 |
| 0.7270833333333333 | 0 |
| 0.7277777777777777 | 0 |
| 0.7284722222222223 | 0 |
| 0.7291666666666666 | 0 |
| 0.7298611111111111 | 0 |
| 0.7305555555555556 | 0 |
| 0.7312500000000001 | 0 |
| 0.7319444444444444 | 0 |
| 0.7326388888888888 | 0 |
| 0.7333333333333334 | 0 |
| 0.7340277777777778 | 0 |
| 0.7347222222222222 | 0 |
| 0.7354166666666666 | 0 |
| 0.7361111111111112 | 0 |
| 0.7368055555555556 | 0 |
| 0.7374999999999999 | 0 |
| 0.7381944444444444 | 0 |
| 0.7388888888888889 | 0 |
| 0.7395833333333334 | 0 |
| 0.7402777777777777 | 0 |
| 0.7409722222222223 | 0 |
| 0.7416666666666667 | 0 |
| 0.7423611111111111 | 0 |
| 0.7430555555555555 | 0 |
| 0.74375 | 0 |
| 0.7444444444444445 | 0 |
| 0.7451388888888889 | 0 |
| 0.7458333333333332 | 0 |
| 0.7465277777777778 | 0 |
| 0.7472222222222222 | 0 |
| 0.7479166666666667 | 0 |
| 0.748611111111111 | 0 |
| 0.7493055555555556 | 0 |
| 0.75 | 0 |
| 0.7506944444444444 | 0 |
| 0.751388888888889 | 0 |
| 0.7520833333333333 | 0 |
| 0.7527777777777778 | 0 |
| 0.7534722222222222 | 0 |
| 0.7541666666666668 | 0 |
| 0.7548611111111111 | 0 |
| 0.7555555555555555 | 0 |
| 0.75625 | 0 |
| 0.7569444444444445 | 0 |
| 0.7576388888888889 | 0 |
| 0.7583333333333333 | 0 |
| 0.7590277777777777 | 0 |
| 0.7597222222222223 | 0 |
| 0.7604166666666666 | 0 |
| 0.7611111111111111 | 0 |
| 0.7618055555555556 | 0 |
| 0.7625000000000001 | 0 |
| 0.7631944444444444 | 0 |
| 0.7638888888888888 | 0 |
| 0.7645833333333334 | 0 |
| 0.7652777777777778 | 0 |
| 0.7659722222222222 | 0 |
| 0.7666666666666666 | 0 |
| 0.7673611111111112 | 0 |
| 0.7680555555555556 | 0 |
| 0.7687499999999999 | 0 |
| 0.7694444444444444 | 0 |
| 0.7701388888888889 | 0 |
| 0.7708333333333334 | 0 |
| 0.7715277777777777 | 0 |
| 0.7722222222222223 | 0 |
| 0.7729166666666667 | 0 |
| 0.7736111111111111 | 0 |
| 0.7743055555555555 | 0 |
| 0.775 | 0 |
| 0.7756944444444445 | 0 |
| 0.7763888888888889 | 0 |
| 0.7770833333333332 | 0 |
| 0.7777777777777778 | 0 |
| 0.7784722222222222 | 0 |
| 0.7791666666666667 | 0 |
| 0.779861111111111 | 0 |
| 0.7805555555555556 | 0 |
| 0.78125 | 0 |
| 0.7819444444444444 | 0 |
| 0.782638888888889 | 0 |
| 0.7833333333333333 | 0 |
| 0.7840277777777778 | 0 |
| 0.7847222222222222 | 0 |
| 0.7854166666666668 | 0 |
| 0.7861111111111111 | 0 |
| 0.7868055555555555 | 0 |
| 0.7875 | 0 |
| 0.7881944444444445 | 0 |
| 0.7888888888888889 | 0 |
| 0.7895833333333333 | 0 |
| 0.7902777777777777 | 0 |
| 0.7909722222222223 | 0 |
| 0.7916666666666666 | 0 |
| 0.7923611111111111 | 0 |
| 0.7930555555555556 | 0 |
| 0.7937500000000001 | 0 |
| 0.7944444444444444 | 0 |
| 0.7951388888888888 | 0 |
| 0.7958333333333334 | 0 |
| 0.7965277777777778 | 0 |
| 0.7972222222222222 | 0 |
| 0.7979166666666666 | 0 |
| 0.7986111111111112 | 0 |
| 0.7993055555555556 | 0 |
| 0.7999999999999999 | 0 |
| 0.8006944444444444 | 0 |
| 0.8013888888888889 | 0 |
| 0.8020833333333334 | 0 |
| 0.8027777777777777 | 0 |
| 0.8034722222222223 | 0 |
| 0.8041666666666667 | 0 |
| 0.8048611111111111 | 0 |
| 0.8055555555555555 | 0 |
| 0.80625 | 0 |
| 0.8069444444444445 | 0 |
| 0.8076388888888889 | 0 |
| 0.8083333333333332 | 0 |
| 0.8090277777777778 | 0 |
| 0.8097222222222222 | 0 |
| 0.8104166666666667 | 0 |
| 0.811111111111111 | 0 |
| 0.8118055555555556 | 0 |
| 0.8125 | 0 |
| 0.8131944444444444 | 0 |
| 0.813888888888889 | 0 |
| 0.8145833333333333 | 0 |
| 0.8152777777777778 | 0 |
| 0.8159722222222222 | 0 |
| 0.8166666666666668 | 0 |
| 0.8173611111111111 | 0 |
| 0.8180555555555555 | 0 |
| 0.81875 | 0 |
| 0.8194444444444445 | 0 |
| 0.8201388888888889 | 0 |
| 0.8208333333333333 | 0 |
| 0.8215277777777777 | 0 |
| 0.8222222222222223 | 0 |
| 0.8229166666666666 | 0 |
| 0.8236111111111111 | 0 |
| 0.8243055555555556 | 0 |
| 0.8250000000000001 | 0 |
| 0.8256944444444444 | 0 |
| 0.8263888888888888 | 0 |
| 0.8270833333333334 | 0 |
| 0.8277777777777778 | 0 |
| 0.8284722222222222 | 0 |
| 0.8291666666666666 | 0 |
| 0.8298611111111112 | 0 |
| 0.8305555555555556 | 0 |
| 0.8312499999999999 | 0 |
| 0.8319444444444444 | 0 |
| 0.8326388888888889 | 0 |
| 0.8333333333333334 | 0 |
| 0.8340277777777777 | 0 |
| 0.8347222222222223 | 0 |
| 0.8354166666666667 | 0 |
| 0.8361111111111111 | 0 |
| 0.8368055555555555 | 0 |
| 0.8375 | 0 |
| 0.8381944444444445 | 0 |
| 0.8388888888888889 | 0 |
| 0.8395833333333332 | 0 |
| 0.8402777777777778 | 0 |
| 0.8409722222222222 | 0 |
| 0.8416666666666667 | 0 |
| 0.842361111111111 | 0 |
| 0.8430555555555556 | 0 |
| 0.84375 | 0 |
| 0.8444444444444444 | 0 |
| 0.845138888888889 | 0 |
| 0.8458333333333333 | 0 |
| 0.8465277777777778 | 0 |
| 0.8472222222222222 | 0 |
| 0.8479166666666668 | 0 |
| 0.8486111111111111 | 0 |
| 0.8493055555555555 | 0 |
| 0.85 | 0 |
| 0.8506944444444445 | 0 |
| 0.8513888888888889 | 0 |
| 0.8520833333333333 | 0 |
| 0.8527777777777777 | 0 |
| 0.8534722222222223 | 0 |
| 0.8541666666666666 | 0 |
| 0.8548611111111111 | 0 |
| 0.8555555555555556 | 0 |
| 0.8562500000000001 | 0 |
| 0.8569444444444444 | 0 |
| 0.8576388888888888 | 0 |
| 0.8583333333333334 | 0 |
| 0.8590277777777778 | 0 |
| 0.8597222222222222 | 0 |
| 0.8604166666666666 | 0 |
| 0.8611111111111112 | 0 |
| 0.8618055555555556 | 0 |
| 0.8624999999999999 | 0 |
| 0.8631944444444444 | 0 |
| 0.8638888888888889 | 0 |
| 0.8645833333333334 | 0 |
| 0.8652777777777777 | 0 |
| 0.8659722222222223 | 0 |
| 0.8666666666666667 | 0 |
| 0.8673611111111111 | 0 |
| 0.8680555555555555 | 0 |
| 0.86875 | 0 |
| 0.8694444444444445 | 0 |
| 0.8701388888888889 | 0 |
| 0.8708333333333332 | 0 |
| 0.8715277777777778 | 0 |
| 0.8722222222222222 | 0 |
| 0.8729166666666667 | 0 |
| 0.873611111111111 | 0 |
| 0.8743055555555556 | 0 |
| 0.875 | 0 |
| 0.8756944444444444 | 0 |
| 0.876388888888889 | 0 |
| 0.8770833333333333 | 0 |
| 0.8777777777777778 | 0 |
| 0.8784722222222222 | 0 |
| 0.8791666666666668 | 0 |
| 0.8798611111111111 | 0 |
| 0.8805555555555555 | 0 |
| 0.88125 | 0 |
| 0.8819444444444445 | 0 |
| 0.8826388888888889 | 0 |
| 0.8833333333333333 | 0 |
| 0.8840277777777777 | 0 |
| 0.8847222222222223 | 0 |
| 0.8854166666666666 | 0 |
| 0.8861111111111111 | 0 |
| 0.8868055555555556 | 0 |
| 0.8875000000000001 | 0 |
| 0.8881944444444444 | 0 |
| 0.8888888888888888 | 0 |
| 0.8895833333333334 | 0 |
| 0.8902777777777778 | 0 |
| 0.8909722222222222 | 0 |
| 0.8916666666666666 | 0 |
| 0.8923611111111112 | 0 |
| 0.8930555555555556 | 0 |
| 0.8937499999999999 | 0 |
| 0.8944444444444444 | 0 |
| 0.8951388888888889 | 0 |
| 0.8958333333333334 | 0 |
| 0.8965277777777777 | 0 |
| 0.8972222222222223 | 0 |
| 0.8979166666666667 | 0 |
| 0.8986111111111111 | 0 |
| 0.8993055555555555 | 0 |
| 0.9 | 0 |
| 0.9006944444444445 | 0 |
| 0.9013888888888889 | 0 |
| 0.9020833333333332 | 0 |
| 0.9027777777777778 | 0 |
| 0.9034722222222222 | 0 |
| 0.9041666666666667 | 0 |
| 0.904861111111111 | 0 |
| 0.9055555555555556 | 0 |
| 0.90625 | 0 |
| 0.9069444444444444 | 0 |
| 0.907638888888889 | 0 |
| 0.9083333333333333 | 0 |
| 0.9090277777777778 | 0 |
| 0.9097222222222222 | 0 |
| 0.9104166666666668 | 0 |
| 0.9111111111111111 | 0 |
| 0.9118055555555555 | 0 |
| 0.9125 | 0 |
| 0.9131944444444445 | 0 |
| 0.9138888888888889 | 0 |
| 0.9145833333333333 | 0 |
| 0.9152777777777777 | 0 |
| 0.9159722222222223 | 0 |
| 0.9166666666666666 | 0 |
| 0.9173611111111111 | 0 |
| 0.9180555555555556 | 0 |
| 0.9187500000000001 | 0 |
| 0.9194444444444444 | 0 |
| 0.9201388888888888 | 0 |
| 0.9208333333333334 | 0 |
| 0.9215277777777778 | 0 |
| 0.9222222222222222 | 0 |
| 0.9229166666666666 | 0 |
| 0.9236111111111112 | 0 |
| 0.9243055555555556 | 0 |
| 0.9249999999999999 | 0 |
| 0.9256944444444444 | 0 |
| 0.9263888888888889 | 0 |
| 0.9270833333333334 | 0 |
| 0.9277777777777777 | 0 |
| 0.9284722222222223 | 0 |
| 0.9291666666666667 | 0 |
| 0.9298611111111111 | 0 |
| 0.9305555555555555 | 0 |
| 0.93125 | 0 |
| 0.9319444444444445 | 0 |
| 0.9326388888888889 | 0 |
| 0.9333333333333332 | 0 |
| 0.9340277777777778 | 0 |
| 0.9347222222222222 | 0 |
| 0.9354166666666667 | 0 |
| 0.936111111111111 | 0 |
| 0.9368055555555556 | 0 |
| 0.9375 | 0 |
| 0.9381944444444444 | 0 |
| 0.938888888888889 | 0 |
| 0.9395833333333333 | 0 |
| 0.9402777777777778 | 0 |
| 0.9409722222222222 | 0 |
| 0.9416666666666668 | 0 |
| 0.9423611111111111 | 0 |
| 0.9430555555555555 | 0 |
| 0.94375 | 0 |
| 0.9444444444444445 | 0 |
| 0.9451388888888889 | 0 |
| 0.9458333333333333 | 0 |
| 0.9465277777777777 | 0 |
| 0.9472222222222223 | 0 |
| 0.9479166666666666 | 0 |
| 0.9486111111111111 | 0 |
| 0.9493055555555556 | 0 |
| 0.9500000000000001 | 0 |
| 0.9506944444444444 | 0 |
| 0.9513888888888888 | 0 |
| 0.9520833333333334 | 0 |
| 0.9527777777777778 | 0 |
| 0.9534722222222222 | 0 |
| 0.9541666666666666 | 0 |
| 0.9548611111111112 | 0 |
| 0.9555555555555556 | 0 |
| 0.9562499999999999 | 0 |
| 0.9569444444444444 | 0 |
| 0.9576388888888889 | 0 |
| 0.9583333333333334 | 0 |
| 0.9590277777777777 | 0 |
| 0.9597222222222223 | 0 |
| 0.9604166666666667 | 0 |
| 0.9611111111111111 | 0 |
| 0.9618055555555555 | 0 |
| 0.9625 | 0 |
| 0.9631944444444445 | 0 |
| 0.9638888888888889 | 0 |
| 0.9645833333333332 | 0 |
| 0.9652777777777778 | 0 |
| 0.9659722222222222 | 0 |
| 0.9666666666666667 | 0 |
| 0.967361111111111 | 0 |
| 0.9680555555555556 | 0 |
| 0.96875 | 0 |
| 0.9694444444444444 | 0 |
| 0.970138888888889 | 0 |
| 0.9708333333333333 | 0 |
| 0.9715277777777778 | 0 |
| 0.9722222222222222 | 0 |
| 0.9729166666666668 | 0 |
| 0.9736111111111111 | 0 |
| 0.9743055555555555 | 0 |
| 0.975 | 0 |
| 0.9756944444444445 | 0 |
| 0.9763888888888889 | 0 |
| 0.9770833333333333 | 0 |
| 0.9777777777777777 | 0 |
| 0.9784722222222223 | 0 |
| 0.9791666666666666 | 0 |
| 0.9798611111111111 | 0 |
| 0.9805555555555556 | 0 |
| 0.9812500000000001 | 0 |
| 0.9819444444444444 | 0 |
| 0.9826388888888888 | 0 |
| 0.9833333333333334 | 0 |
| 0.9840277777777778 | 0 |
| 0.9847222222222222 | 0 |
| 0.9854166666666666 | 0 |
| 0.9861111111111112 | 0 |
| 0.9868055555555556 | 0 |
| 0.9874999999999999 | 0 |
| 0.9881944444444444 | 0 |
| 0.9888888888888889 | 0 |
| 0.9895833333333334 | 0 |
| 0.9902777777777777 | 0 |
| 0.9909722222222223 | 0 |
| 0.9916666666666667 | 0 |
| 0.9923611111111111 | 0 |
| 0.9930555555555555 | 0 |
| 0.99375 | 0 |
| 0.9944444444444445 | 0 |
| 0.9951388888888889 | 0 |
| 0.9958333333333332 | 0 |
| 0.9965277777777778 | 0 |
| 0.9972222222222222 | 0 |
| 0.9979166666666667 | 0 |
| 0.998611111111111 | 0 |
| 0.9993055555555556 | 0 |